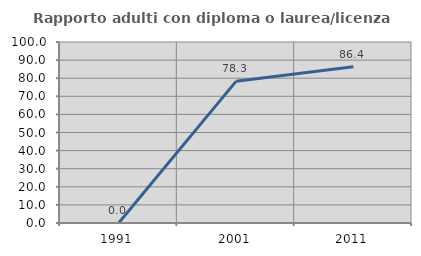
| Category | Rapporto adulti con diploma o laurea/licenza media  |
|---|---|
| 1991.0 | 0 |
| 2001.0 | 78.261 |
| 2011.0 | 86.364 |